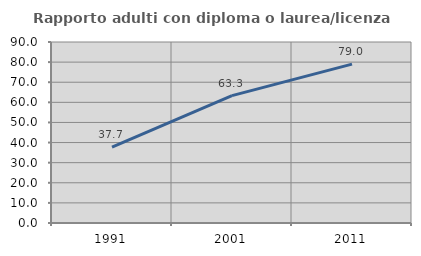
| Category | Rapporto adulti con diploma o laurea/licenza media  |
|---|---|
| 1991.0 | 37.681 |
| 2001.0 | 63.312 |
| 2011.0 | 79.009 |